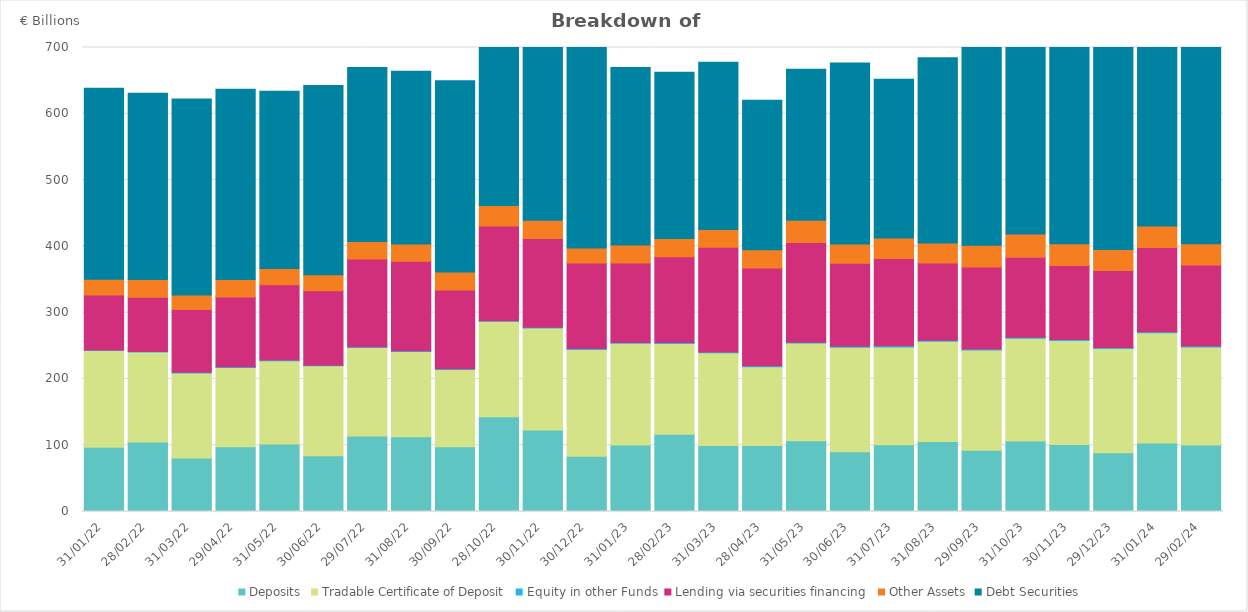
| Category | Deposits | Tradable Certificate of Deposit | Equity in other Funds | Lending via securities financing  | Other Assets | Debt Securities |
|---|---|---|---|---|---|---|
| 2022-01-31 | 96.931 | 145.783 | 0.951 | 82.998 | 23.782 | 288.022 |
| 2022-02-28 | 104.979 | 135.542 | 0.958 | 81.764 | 26.849 | 280.936 |
| 2022-03-31 | 80.633 | 128.457 | 0.891 | 94.76 | 22.064 | 295.665 |
| 2022-04-29 | 97.612 | 119.74 | 0.967 | 105.41 | 26.41 | 286.718 |
| 2022-05-31 | 101.959 | 125.629 | 0.978 | 113.582 | 24.392 | 267.425 |
| 2022-06-30 | 84.23 | 135.586 | 0.878 | 112.255 | 24.147 | 285.732 |
| 2022-07-29 | 113.998 | 133.584 | 0.941 | 132.268 | 26.511 | 262.645 |
| 2022-08-31 | 112.946 | 128.389 | 1.121 | 135.04 | 26.093 | 260.702 |
| 2022-09-30 | 97.817 | 116.577 | 0.971 | 118.666 | 27.367 | 288.49 |
| 2022-10-28 | 143.019 | 143.832 | 1.017 | 142.983 | 30.956 | 297.944 |
| 2022-11-30 | 122.764 | 154.139 | 1.043 | 134.023 | 27.581 | 304.953 |
| 2022-12-30 | 83.366 | 161.193 | 1.222 | 128.925 | 22.665 | 302.782 |
| 2023-01-31 | 100.171 | 153.568 | 1.288 | 119.974 | 26.982 | 267.843 |
| 2023-02-28 | 116.596 | 136.961 | 1.342 | 129.497 | 27.521 | 250.886 |
| 2023-03-31 | 99.51 | 139.93 | 1.221 | 157.945 | 26.846 | 252.237 |
| 2023-04-28 | 99.71 | 118.618 | 1.482 | 147.59 | 27.376 | 225.646 |
| 2023-05-31 | 106.898 | 147.175 | 1.3 | 150.427 | 33.691 | 227.549 |
| 2023-06-30 | 90.308 | 157.571 | 1.429 | 125.268 | 28.982 | 272.938 |
| 2023-07-31 | 100.666 | 147.634 | 1.692 | 131.514 | 30.945 | 239.728 |
| 2023-08-31 | 105.467 | 151.48 | 1.518 | 116.315 | 30.197 | 279.502 |
| 2023-09-29 | 92.274 | 151.375 | 1.604 | 123.79 | 32.715 | 300.374 |
| 2023-10-31 | 106.234 | 154.997 | 1.521 | 120.907 | 35.008 | 286.899 |
| 2023-11-30 | 101.01 | 156.797 | 1.543 | 111.625 | 33.007 | 331.991 |
| 2023-12-29 | 88.472 | 157.546 | 1.451 | 116.062 | 31.579 | 341.16 |
| 2024-01-31 | 103.444 | 166.311 | 1.455 | 127.158 | 32.38 | 326.504 |
| 2024-02-29 | 100.393 | 147.815 | 1.474 | 122.056 | 32.376 | 312.561 |